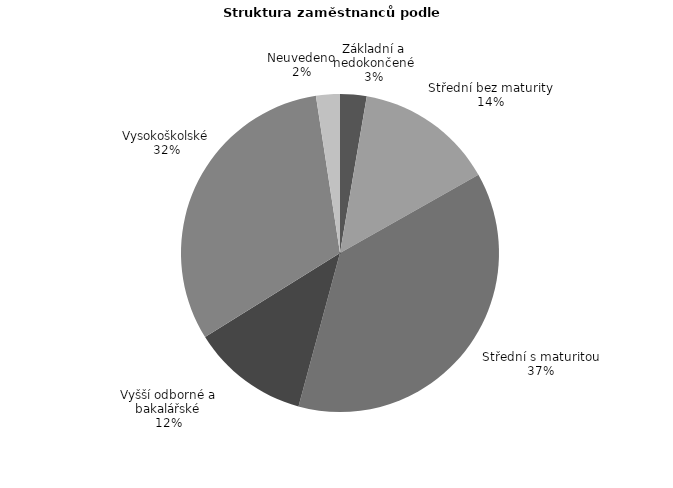
| Category | Series 0 |
|---|---|
| Základní a nedokončené | 17.565 |
| Střední bez maturity | 91.925 |
| Střední s maturitou | 243.512 |
| Vyšší odborné a bakalářské | 77.65 |
| Vysokoškolské | 204.789 |
| Neuvedeno | 15.788 |